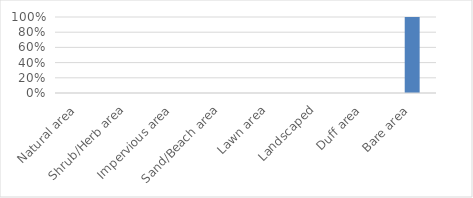
| Category | Series 0 |
|---|---|
| Natural area | 0 |
| Shrub/Herb area | 0 |
| Impervious area | 0 |
| Sand/Beach area | 0 |
| Lawn area | 0 |
| Landscaped | 0 |
| Duff area | 0 |
| Bare area | 1 |